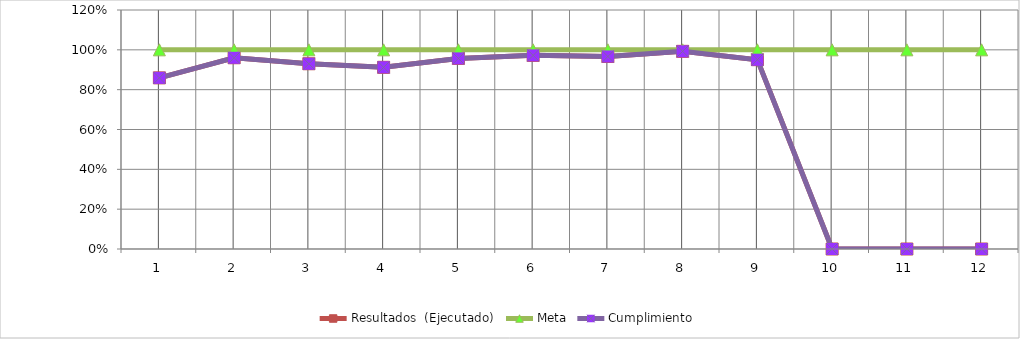
| Category | Resultados  (Ejecutado) | Meta | Cumplimiento |
|---|---|---|---|
| 0 | 0.859 | 1 | 0.859 |
| 1 | 0.96 | 1 | 0.96 |
| 2 | 0.93 | 1 | 0.93 |
| 3 | 0.912 | 1 | 0.912 |
| 4 | 0.957 | 1 | 0.957 |
| 5 | 0.972 | 1 | 0.972 |
| 6 | 0.967 | 1 | 0.967 |
| 7 | 0.992 | 1 | 0.992 |
| 8 | 0.95 | 1 | 0.95 |
| 9 | 0 | 1 | 0 |
| 10 | 0 | 1 | 0 |
| 11 | 0 | 1 | 0 |